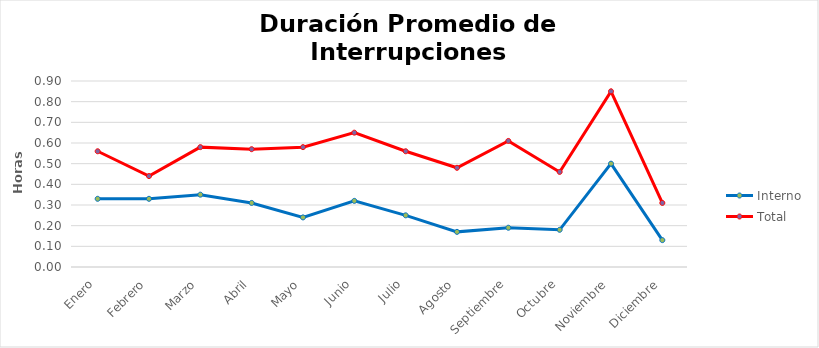
| Category | Interno | Total |
|---|---|---|
| Enero | 0.33 | 0.56 |
| Febrero | 0.33 | 0.44 |
| Marzo | 0.35 | 0.58 |
| Abril | 0.31 | 0.57 |
| Mayo | 0.24 | 0.58 |
| Junio | 0.32 | 0.65 |
| Julio | 0.25 | 0.56 |
| Agosto | 0.17 | 0.48 |
| Septiembre | 0.19 | 0.61 |
| Octubre | 0.18 | 0.46 |
| Noviembre | 0.5 | 0.85 |
| Diciembre | 0.13 | 0.31 |